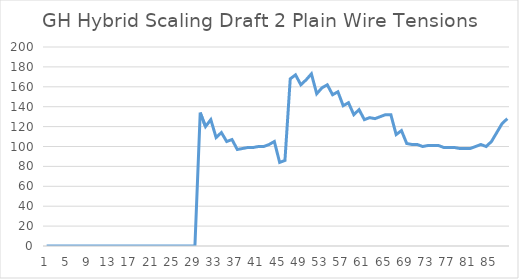
| Category | Series 0 |
|---|---|
| 0 | 0 |
| 1 | 0 |
| 2 | 0 |
| 3 | 0 |
| 4 | 0 |
| 5 | 0 |
| 6 | 0 |
| 7 | 0 |
| 8 | 0 |
| 9 | 0 |
| 10 | 0 |
| 11 | 0 |
| 12 | 0 |
| 13 | 0 |
| 14 | 0 |
| 15 | 0 |
| 16 | 0 |
| 17 | 0 |
| 18 | 0 |
| 19 | 0 |
| 20 | 0 |
| 21 | 0 |
| 22 | 0 |
| 23 | 0 |
| 24 | 0 |
| 25 | 0 |
| 26 | 0 |
| 27 | 0 |
| 28 | 0 |
| 29 | 134 |
| 30 | 120 |
| 31 | 127 |
| 32 | 109 |
| 33 | 114 |
| 34 | 105 |
| 35 | 107 |
| 36 | 97 |
| 37 | 98 |
| 38 | 99 |
| 39 | 99 |
| 40 | 100 |
| 41 | 100 |
| 42 | 102 |
| 43 | 105 |
| 44 | 84 |
| 45 | 86 |
| 46 | 168 |
| 47 | 172 |
| 48 | 162 |
| 49 | 167 |
| 50 | 173 |
| 51 | 153 |
| 52 | 159 |
| 53 | 162 |
| 54 | 152 |
| 55 | 155 |
| 56 | 141 |
| 57 | 144 |
| 58 | 132 |
| 59 | 137 |
| 60 | 127 |
| 61 | 129 |
| 62 | 128 |
| 63 | 130 |
| 64 | 132 |
| 65 | 132 |
| 66 | 112 |
| 67 | 116 |
| 68 | 103 |
| 69 | 102 |
| 70 | 102 |
| 71 | 100 |
| 72 | 101 |
| 73 | 101 |
| 74 | 101 |
| 75 | 99 |
| 76 | 99 |
| 77 | 99 |
| 78 | 98 |
| 79 | 98 |
| 80 | 98 |
| 81 | 100 |
| 82 | 102 |
| 83 | 100 |
| 84 | 105 |
| 85 | 114 |
| 86 | 123 |
| 87 | 128 |